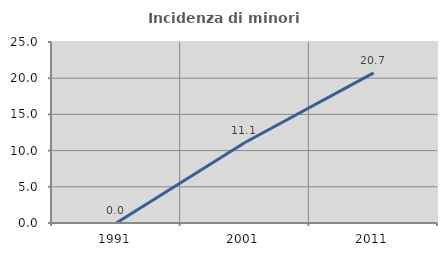
| Category | Incidenza di minori stranieri |
|---|---|
| 1991.0 | 0 |
| 2001.0 | 11.111 |
| 2011.0 | 20.732 |